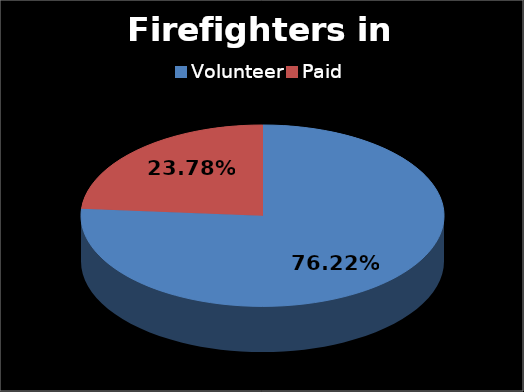
| Category | Series 0 |
|---|---|
| Volunteer | 0.762 |
| Paid | 0.238 |